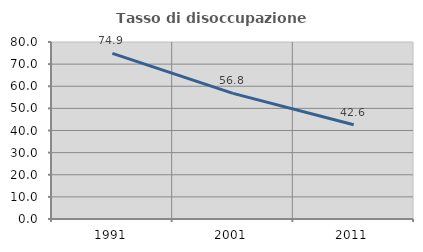
| Category | Tasso di disoccupazione giovanile  |
|---|---|
| 1991.0 | 74.863 |
| 2001.0 | 56.8 |
| 2011.0 | 42.623 |